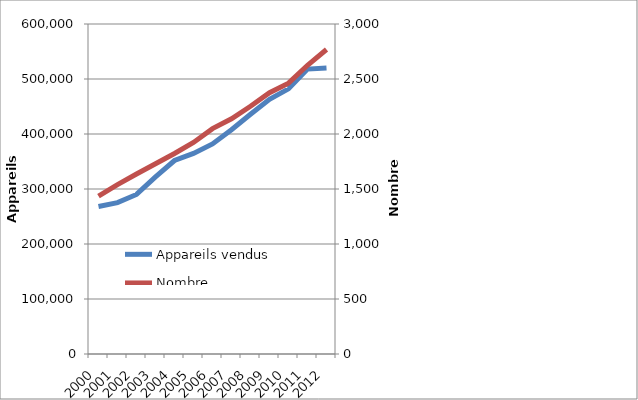
| Category | Appareils vendus |
|---|---|
| 2000.0 | 268248 |
| 2001.0 | 275297 |
| 2002.0 | 290090 |
| 2003.0 | 321998 |
| 2004.0 | 351773 |
| 2005.0 | 364647 |
| 2006.0 | 381934 |
| 2007.0 | 407796 |
| 2008.0 | 435884 |
| 2009.0 | 463118 |
| 2010.0 | 482155 |
| 2011.0 | 518045 |
| 2012.0 | 519994 |